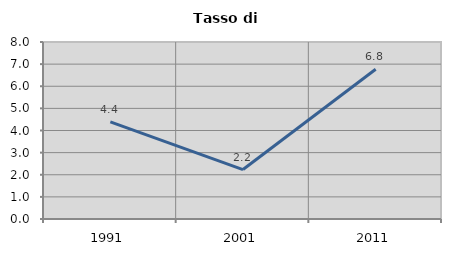
| Category | Tasso di disoccupazione   |
|---|---|
| 1991.0 | 4.39 |
| 2001.0 | 2.234 |
| 2011.0 | 6.768 |